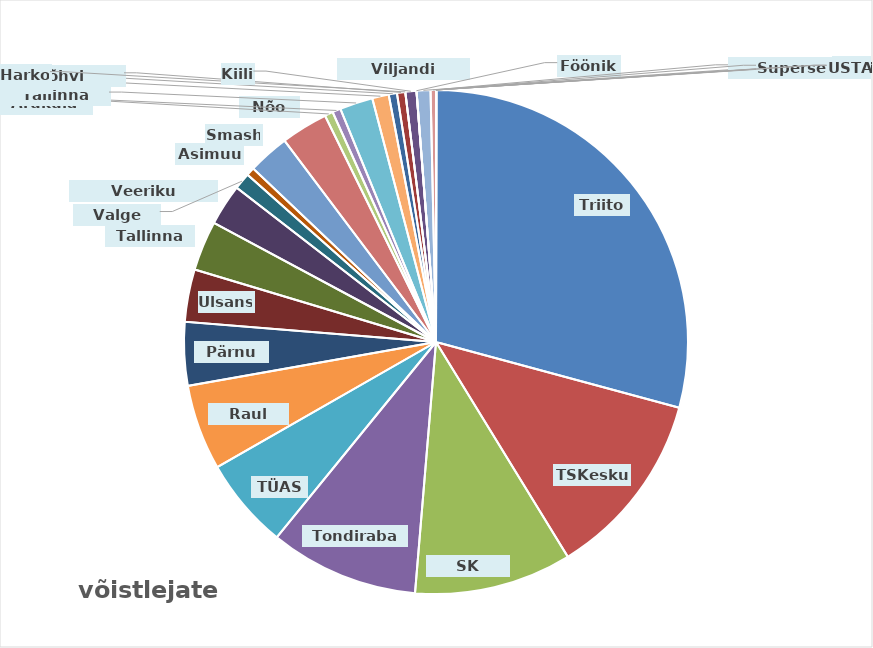
| Category | kokku |
|---|---|
| Triiton | 165 |
| TSKeskus | 68 |
| SK Fookus | 57 |
| Tondiraba SK | 54 |
| TÜASK | 33 |
| Raul Must | 31 |
| Pärnu SK | 23 |
| Ulsans | 19 |
| Tallinna SK | 18 |
| Veeriku Badminton | 15 |
| Valge Hani | 6 |
| Asimuut | 3 |
| Smash | 15 |
| Nõo SK | 17 |
| Rakvere SK | 3 |
| Aruküla SK | 3 |
| Tallinna Kalev | 12 |
| Kuuse | 6 |
| TalTech | 3 |
| Jõhvi Spordikool | 3 |
| Harko | 0 |
| Kiili | 4 |
| Viljandi Sulelised | 0 |
| Fööniks | 0 |
| Võru | 5 |
| Anija Sulgpalliklubi | 2 |
| Viimsi | 0 |
| Sarv | 0 |
| Superseeniorid | 0 |
| Puhja | 0 |
| USTA | 0 |